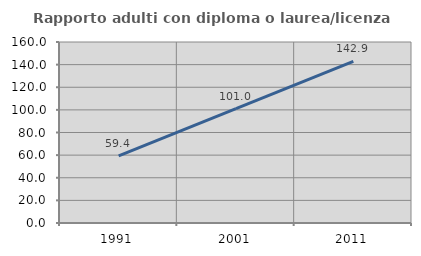
| Category | Rapporto adulti con diploma o laurea/licenza media  |
|---|---|
| 1991.0 | 59.375 |
| 2001.0 | 101.042 |
| 2011.0 | 142.857 |